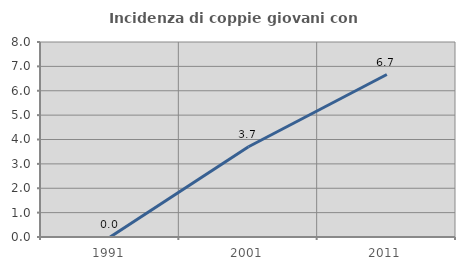
| Category | Incidenza di coppie giovani con figli |
|---|---|
| 1991.0 | 0 |
| 2001.0 | 3.704 |
| 2011.0 | 6.667 |